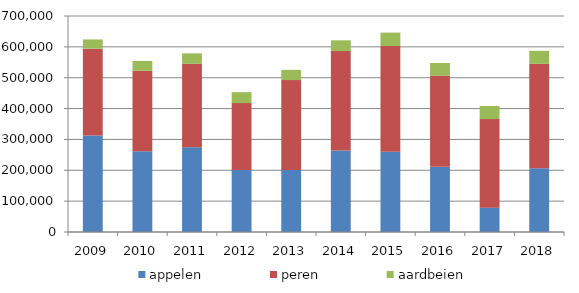
| Category | appelen | peren | aardbeien |
|---|---|---|---|
| 2009.0 | 312371 | 281778 | 29941 |
| 2010.0 | 262007 | 260521 | 31835 |
| 2011.0 | 274650 | 270381 | 33949 |
| 2012.0 | 200811 | 216893 | 35559 |
| 2013.0 | 201314 | 290906 | 33220 |
| 2014.0 | 264353 | 321959 | 34880 |
| 2015.0 | 259923 | 342748 | 43498 |
| 2016.0 | 211113 | 295768 | 40734 |
| 2017.0 | 78962 | 286972 | 42530 |
| 2018.0 | 206633 | 338331 | 42186 |